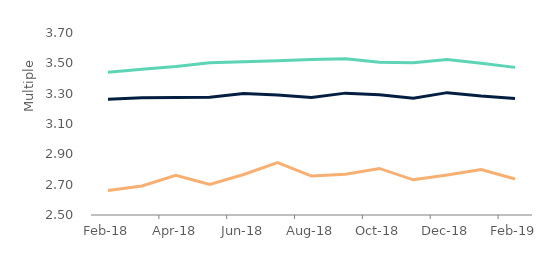
| Category | First-time
buyers | Homemovers | Remortgagors |
|---|---|---|---|
| 2018-02-01 | 3.441 | 3.262 | 2.661 |
| 2018-03-01 | 3.461 | 3.273 | 2.691 |
| 2018-04-01 | 3.479 | 3.274 | 2.761 |
| 2018-05-01 | 3.504 | 3.276 | 2.702 |
| 2018-06-01 | 3.511 | 3.3 | 2.767 |
| 2018-07-01 | 3.517 | 3.291 | 2.845 |
| 2018-08-01 | 3.526 | 3.275 | 2.757 |
| 2018-09-01 | 3.53 | 3.304 | 2.769 |
| 2018-10-01 | 3.508 | 3.293 | 2.807 |
| 2018-11-01 | 3.503 | 3.27 | 2.732 |
| 2018-12-01 | 3.525 | 3.307 | 2.764 |
| 2019-01-01 | 3.501 | 3.284 | 2.8 |
| 2019-02-01 | 3.473 | 3.269 | 2.738 |